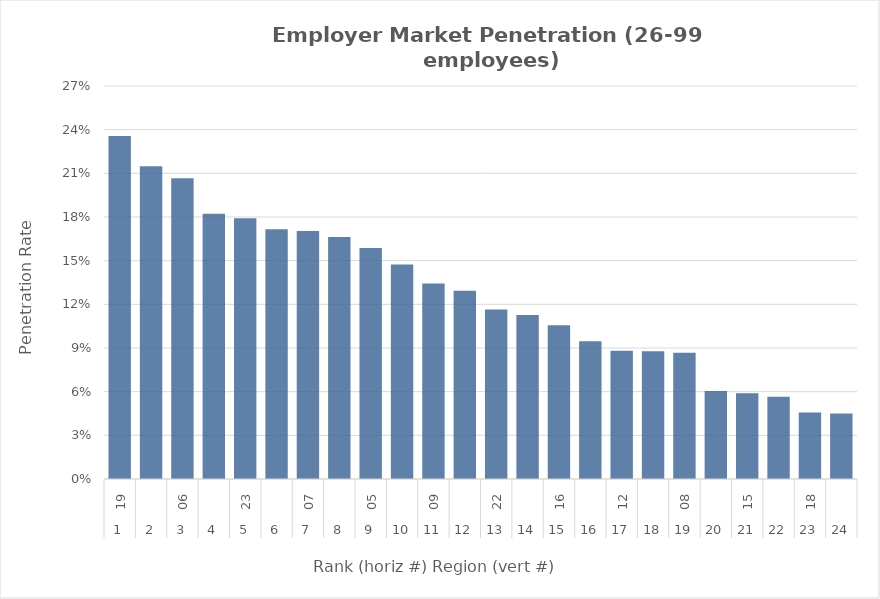
| Category | Rate |
|---|---|
| 0 | 0.236 |
| 1 | 0.215 |
| 2 | 0.207 |
| 3 | 0.182 |
| 4 | 0.179 |
| 5 | 0.172 |
| 6 | 0.17 |
| 7 | 0.166 |
| 8 | 0.159 |
| 9 | 0.147 |
| 10 | 0.134 |
| 11 | 0.129 |
| 12 | 0.116 |
| 13 | 0.113 |
| 14 | 0.106 |
| 15 | 0.095 |
| 16 | 0.088 |
| 17 | 0.088 |
| 18 | 0.087 |
| 19 | 0.061 |
| 20 | 0.059 |
| 21 | 0.056 |
| 22 | 0.046 |
| 23 | 0.045 |